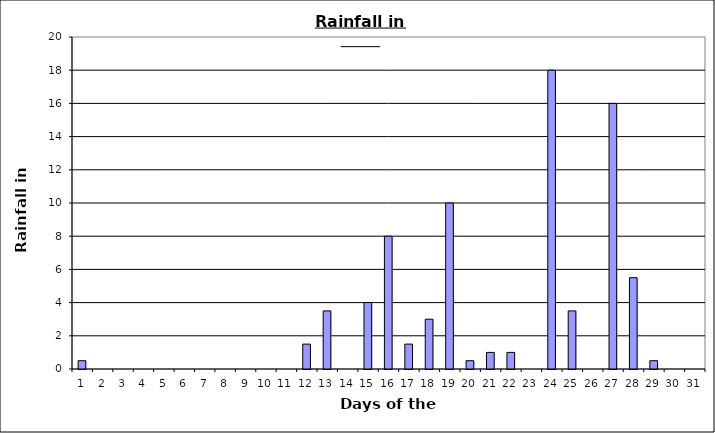
| Category | Series 0 |
|---|---|
| 0 | 0.5 |
| 1 | 0 |
| 2 | 0 |
| 3 | 0 |
| 4 | 0 |
| 5 | 0 |
| 6 | 0 |
| 7 | 0 |
| 8 | 0 |
| 9 | 0 |
| 10 | 0 |
| 11 | 1.5 |
| 12 | 3.5 |
| 13 | 0 |
| 14 | 4 |
| 15 | 8 |
| 16 | 1.5 |
| 17 | 3 |
| 18 | 10 |
| 19 | 0.5 |
| 20 | 1 |
| 21 | 1 |
| 22 | 0 |
| 23 | 18 |
| 24 | 3.5 |
| 25 | 0 |
| 26 | 16 |
| 27 | 5.5 |
| 28 | 0.5 |
| 29 | 0 |
| 30 | 0 |